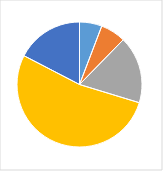
| Category | Series 0 |
|---|---|
| 0 | 0.058 |
| 1 | 0.065 |
| 2 | 0.174 |
| 3 | 0.529 |
| 4 | 0.174 |